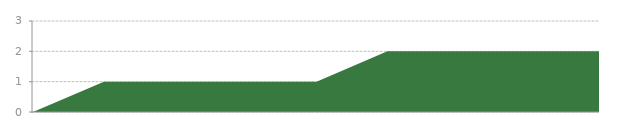
| Category | Series 0 |
|---|---|
| 0 | 0 |
| 1 | 1 |
| 2 | 1 |
| 3 | 1 |
| 4 | 1 |
| 5 | 2 |
| 6 | 2 |
| 7 | 2 |
| 8 | 2 |